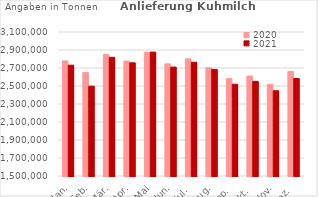
| Category | 2020 | 2021 |
|---|---|---|
| Jan. | 2779008.195 | 2731400.537 |
| Feb. | 2649736.292 | 2498090.446 |
| Mär. | 2848836.123 | 2818877.73 |
| Apr. | 2777074.277 | 2757505.201 |
| Mai | 2875092.325 | 2876510.496 |
| Jun. | 2745853.779 | 2710191.155 |
| Jul. | 2801361.979 | 2764540.029 |
| Aug. | 2702127.312 | 2684422.717 |
| Sep. | 2582327.45 | 2519365.259 |
| Okt. | 2609998.306 | 2551242.811 |
| Nov. | 2519408.917 | 2447164.743 |
| Dez. | 2661295.401 | 2583054.287 |